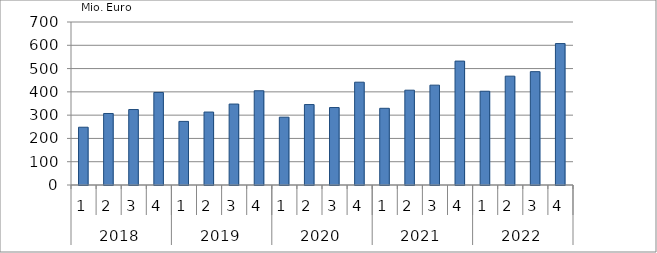
| Category | Ausbaugewerblicher Umsatz3 |
|---|---|
| 0 | 248133.418 |
| 1 | 307099.899 |
| 2 | 324088.989 |
| 3 | 397377.201 |
| 4 | 273159.137 |
| 5 | 313254.251 |
| 6 | 347631.281 |
| 7 | 404721.054 |
| 8 | 291272.144 |
| 9 | 345494.215 |
| 10 | 332629.265 |
| 11 | 441463.36 |
| 12 | 329380.212 |
| 13 | 407164.972 |
| 14 | 428783.222 |
| 15 | 532137.089 |
| 16 | 402625.565 |
| 17 | 467398.849 |
| 18 | 486819.26 |
| 19 | 607390.303 |